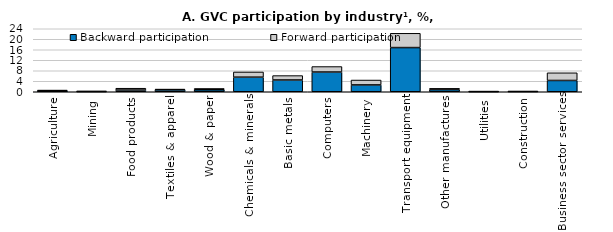
| Category | Backward participation | Forward participation |
|---|---|---|
| Agriculture | 0.397 | 0.23 |
| Mining | 0.058 | 0.23 |
| Food products | 0.647 | 0.7 |
| Textiles & apparel | 0.721 | 0.3 |
| Wood & paper | 0.759 | 0.5 |
| Chemicals & minerals | 5.558 | 1.98 |
| Basic metals | 4.484 | 1.68 |
| Computers | 7.516 | 2.09 |
| Machinery | 2.605 | 1.86 |
| Transport equipment | 16.832 | 5.44 |
| Other manufactures | 0.819 | 0.48 |
| Utilities | 0.066 | 0.06 |
| Construction | 0.103 | 0.04 |
| Business sector services | 4.301 | 2.92 |